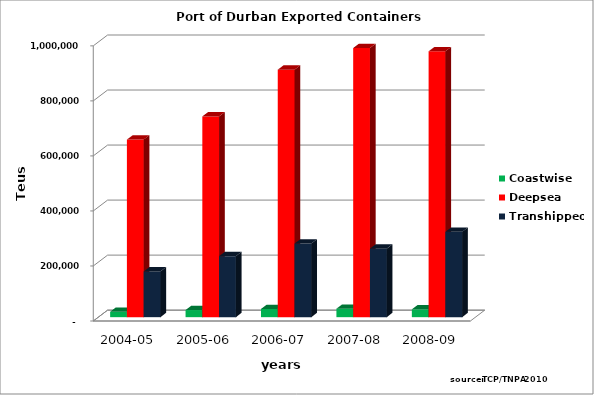
| Category | Coastwise | Deepsea | Transhipped |
|---|---|---|---|
| 2004-05 | 19629 | 645334 | 166205 |
| 2005-06 | 25895 | 729597 | 221844 |
| 2006-07 | 29821 | 899454 | 267521 |
| 2007-08 | 30699 | 978130 | 249046 |
| 2008-09 | 28453 | 966198 | 310135 |